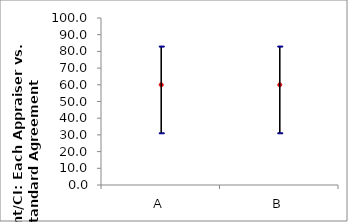
| Category | Percent | 95.0% LC (Score) | 95.0% UC (Score) |
|---|---|---|---|
| A | 60 | 31.267 | 83.182 |
| B | 60 | 31.267 | 83.182 |